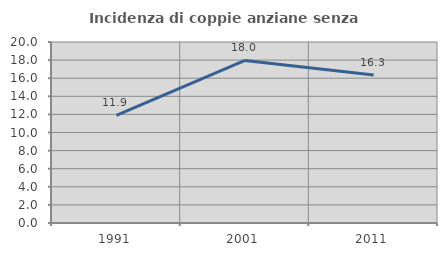
| Category | Incidenza di coppie anziane senza figli  |
|---|---|
| 1991.0 | 11.895 |
| 2001.0 | 17.963 |
| 2011.0 | 16.341 |